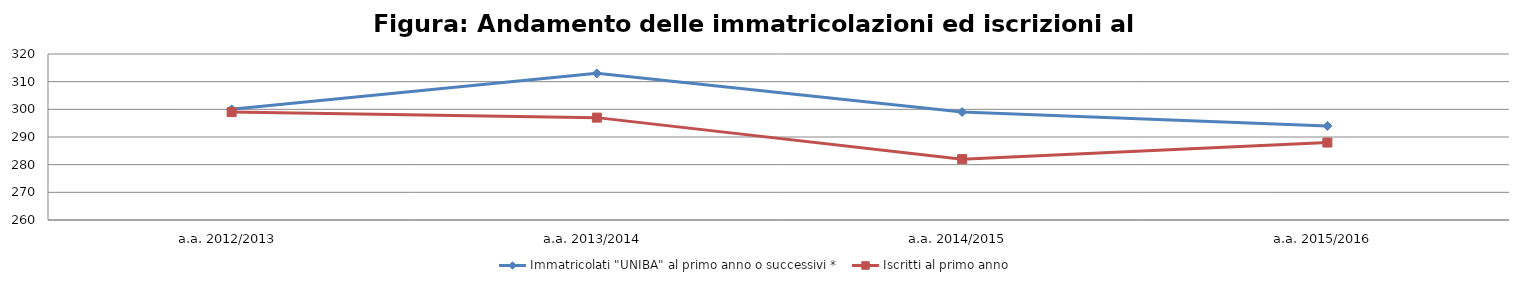
| Category | Immatricolati "UNIBA" al primo anno o successivi * | Iscritti al primo anno  |
|---|---|---|
| a.a. 2012/2013 | 300 | 299 |
| a.a. 2013/2014 | 313 | 297 |
| a.a. 2014/2015 | 299 | 282 |
| a.a. 2015/2016 | 294 | 288 |